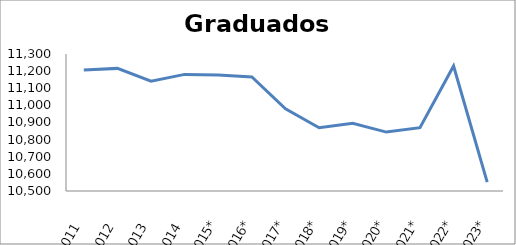
| Category | Series 0 |
|---|---|
| 2011 | 11206 |
| 2012 | 11216 |
| 2013 | 11141 |
| 2014 | 11181 |
| 2015* | 11178 |
| 2016* | 11166 |
| 2017* | 10980 |
| 2018* | 10869 |
| 2019* | 10896 |
| 2020* | 10844 |
| 2021* | 10870 |
| 2022* | 11230 |
| 2023* | 10552 |